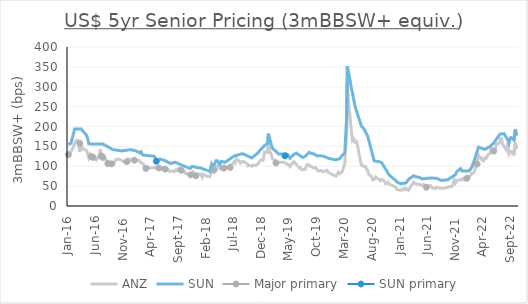
| Category | ANZ | SUN |
|---|---|---|
| 2022-10-13 | 148.5 | 183.5 |
| 2022-10-06 | 147 | 181 |
| 2022-09-29 | 159.5 | 193.5 |
| 2022-09-22 | 130.5 | 165.5 |
| 2022-09-15 | 130.5 | 168 |
| 2022-09-08 | 137.5 | 172 |
| 2022-09-01 | 136.5 | 171.5 |
| 2022-08-25 | 131.5 | 158.5 |
| 2022-08-19 | 158.5 | 165.5 |
| 2022-08-12 | 140.341 | 171 |
| 2022-08-05 | 144.687 | 176.5 |
| 2022-07-28 | 151.103 | 182 |
| 2022-07-21 | 154.136 | 181.667 |
| 2022-07-14 | 172.236 | 181.333 |
| 2022-07-07 | 161.955 | 181 |
| 2022-06-30 | 157.321 | 176.5 |
| 2022-06-23 | 157.205 | 172 |
| 2022-06-16 | 154.849 | 167.5 |
| 2022-06-09 | 141.619 | 163 |
| 2022-06-02 | 140.44 | 158.5 |
| 2022-05-26 | 142.055 | 155.5 |
| 2022-05-19 | 145.334 | 152.5 |
| 2022-05-12 | 131.483 | 149.5 |
| 2022-05-05 | 130.643 | 147.75 |
| 2022-04-28 | 125.82 | 146 |
| 2022-04-21 | 119.404 | 144.25 |
| 2022-04-13 | 120.439 | 142.5 |
| 2022-04-07 | 113.356 | 143.6 |
| 2022-03-31 | 114.188 | 144.7 |
| 2022-03-24 | 121.983 | 145.8 |
| 2022-03-17 | 122.1 | 146.9 |
| 2022-03-10 | 127.907 | 148 |
| 2022-03-03 | 107.577 | 137.5 |
| 2022-02-24 | 101.848 | 127 |
| 2022-02-17 | 87.036 | 117.5 |
| 2022-02-10 | 83.041 | 108 |
| 2022-02-03 | 82.528 | 98.5 |
| 2022-01-20 | 73.951 | 89 |
| 2022-01-13 | 73.574 | 88.533 |
| 2022-01-06 | 71.024 | 88.067 |
| 2021-12-29 | 66.916 | 87.6 |
| 2021-12-22 | 66.223 | 88.5 |
| 2021-12-16 | 68.843 | 88.25 |
| 2021-12-09 | 65.804 | 88 |
| 2021-12-02 | 66.676 | 94 |
| 2021-11-11 | 63.678 | 86.5 |
| 2021-11-04 | 57.914 | 79 |
| 2021-10-28 | 65.005 | 76.875 |
| 2021-10-21 | 53.151 | 74.75 |
| 2021-10-14 | 48.831 | 72.625 |
| 2021-10-07 | 48.622 | 70.5 |
| 2021-09-30 | 49.046 | 68.333 |
| 2021-09-23 | 46.788 | 66.167 |
| 2021-08-20 | 44.039 | 64 |
| 2021-08-13 | 45.116 | 65.375 |
| 2021-08-06 | 45.358 | 66.75 |
| 2021-07-30 | 45.684 | 68.125 |
| 2021-07-23 | 47.023 | 69.5 |
| 2021-07-16 | 43.845 | 69.75 |
| 2021-07-09 | 44.7 | 70 |
| 2021-07-02 | 44.736 | 70.25 |
| 2021-06-25 | 48.301 | 70.5 |
| 2021-06-21 | 50.943 | 70 |
| 2021-05-28 | 51.105 | 69.5 |
| 2021-05-21 | 51.777 | 69 |
| 2021-05-14 | 54.055 | 68.5 |
| 2021-05-07 | 51.357 | 68 |
| 2021-04-30 | 52.515 | 69.6 |
| 2021-04-23 | 54.379 | 71.2 |
| 2021-04-09 | 54.578 | 72.8 |
| 2021-03-26 | 56.686 | 74.4 |
| 2021-03-19 | 59.281 | 76 |
| 2021-03-05 | 50.365 | 71.5 |
| 2021-02-19 | 39.801 | 67 |
| 2021-02-12 | 42.783 | 62.5 |
| 2021-02-05 | 41.109 | 58 |
| 2021-01-29 | 44.645 | 57.5 |
| 2021-01-22 | 40.741 | 57 |
| 2021-01-15 | 42.383 | 56.5 |
| 2021-01-08 | 39.294 | 56 |
| 2020-12-18 | 41.48 | 60 |
| 2020-12-11 | 47.15 | 64 |
| 2020-11-06 | 55.115 | 77.5 |
| 2020-10-30 | 59.536 | 82 |
| 2020-10-23 | 56.068 | 87.4 |
| 2020-10-16 | 56.192 | 92.8 |
| 2020-10-09 | 61.671 | 98.2 |
| 2020-10-02 | 65.692 | 103.6 |
| 2020-09-25 | 66.801 | 109 |
| 2020-09-18 | 63.329 | 110.25 |
| 2020-09-11 | 66.946 | 111.5 |
| 2020-08-21 | 72.761 | 112.75 |
| 2020-08-14 | 66.597 | 114 |
| 2020-08-07 | 65.679 | 126.2 |
| 2020-07-31 | 73.313 | 138.4 |
| 2020-07-24 | 77.172 | 150.6 |
| 2020-07-17 | 78.083 | 162.8 |
| 2020-07-10 | 89.111 | 175 |
| 2020-07-03 | 92.739 | 181.5 |
| 2020-06-26 | 99.387 | 188 |
| 2020-06-19 | 99.484 | 194.5 |
| 2020-06-05 | 103.141 | 201 |
| 2020-05-29 | 117.304 | 211 |
| 2020-05-22 | 133.469 | 221 |
| 2020-05-15 | 152.922 | 231 |
| 2020-05-08 | 162.392 | 241 |
| 2020-05-01 | 160.503 | 251 |
| 2020-04-24 | 168.605 | 267.833 |
| 2020-04-17 | 164.95 | 284.667 |
| 2020-04-09 | 196.654 | 301.5 |
| 2020-04-03 | 229.939 | 318.333 |
| 2020-03-27 | 253.087 | 335.167 |
| 2020-03-20 | 307.672 | 352 |
| 2020-03-16 | 191.612 | 222 |
| 2020-03-06 | 106.522 | 136 |
| 2020-03-03 | 103.903 | 131.75 |
| 2020-02-21 | 86.15 | 127.5 |
| 2020-02-14 | 83.234 | 123.25 |
| 2020-02-07 | 81.844 | 119 |
| 2020-01-31 | 84.77 | 118 |
| 2020-01-24 | 78.778 | 117 |
| 2020-01-17 | 75.128 | 116 |
| 2019-12-06 | 84.26 | 120 |
| 2019-11-29 | 89.695 | 122 |
| 2019-11-15 | 86.782 | 124 |
| 2019-11-08 | 86.382 | 126 |
| 2019-10-25 | 89.292 | 126.125 |
| 2019-10-18 | 88.122 | 126.25 |
| 2019-10-11 | 87.872 | 126.375 |
| 2019-10-04 | 92.882 | 126.5 |
| 2019-09-27 | 96.922 | 128.625 |
| 2019-09-20 | 95.314 | 130.75 |
| 2019-08-30 | 100.058 | 132.875 |
| 2019-08-23 | 102.121 | 135 |
| 2019-08-16 | 104.313 | 131.75 |
| 2019-08-09 | 102.363 | 128.5 |
| 2019-08-02 | 92.27 | 125.25 |
| 2019-07-19 | 91.524 | 122 |
| 2019-07-12 | 91.504 | 124.2 |
| 2019-07-05 | 97.15 | 126.4 |
| 2019-06-28 | 96.326 | 128.6 |
| 2019-06-21 | 100.782 | 130.8 |
| 2019-06-14 | 104.834 | 133 |
| 2019-05-31 | 111.43 | 129.75 |
| 2019-05-24 | 108.853 | 126.5 |
| 2019-05-17 | 104.897 | 123.25 |
| 2019-05-10 | 99.051 | 120 |
| 2019-04-26 | 105.381 | 130 |
| 2019-04-12 | 108.349 | 130.333 |
| 2019-04-03 | 110.038 | 130.667 |
| 2019-03-08 | 110 | 131 |
| 2019-03-01 | 110 | 134 |
| 2019-02-22 | 111.48 | 137 |
| 2019-02-15 | 115.76 | 140 |
| 2019-02-08 | 117 | 143 |
| 2019-02-01 | 119.5 | 146 |
| 2019-01-25 | 132.5 | 158 |
| 2019-01-18 | 137 | 170 |
| 2019-01-11 | 159.5 | 182 |
| 2019-01-07 | 135 | 157 |
| 2018-12-21 | 136 | 152.4 |
| 2018-12-13 | 115.5 | 147.8 |
| 2018-12-03 | 116.5 | 143.2 |
| 2018-11-23 | 112 | 139 |
| 2018-11-16 | 107 | 134 |
| 2018-11-02 | 101.5 | 128.8 |
| 2018-10-26 | 102.5 | 126.2 |
| 2018-10-19 | 102.5 | 123.6 |
| 2018-10-12 | 100 | 121 |
| 2018-10-05 | 102 | 122.5 |
| 2018-09-28 | 102 | 124 |
| 2018-09-21 | 101 | 125.5 |
| 2018-09-17 | 106.5 | 127 |
| 2018-09-07 | 109 | 128.5 |
| 2018-08-31 | 111.5 | 130 |
| 2018-08-17 | 111 | 131.5 |
| 2018-08-10 | 108 | 130.5 |
| 2018-08-03 | 114 | 129.5 |
| 2018-07-27 | 114 | 128.5 |
| 2018-07-20 | 119 | 127.5 |
| 2018-07-12 | 108.5 | 126.5 |
| 2018-07-06 | 111 | 125.5 |
| 2018-06-29 | 106.5 | 123.286 |
| 2018-06-22 | 103 | 121.071 |
| 2018-06-15 | 100.5 | 118.857 |
| 2018-06-08 | 96.5 | 116.643 |
| 2018-06-01 | 95.5 | 114.429 |
| 2018-05-25 | 98 | 112.214 |
| 2018-05-18 | 98 | 110 |
| 2018-05-11 | 91 | 110.8 |
| 2018-05-04 | 93 | 111.6 |
| 2018-04-27 | 93 | 112.4 |
| 2018-04-20 | 93 | 104 |
| 2018-04-06 | 101 | 114 |
| 2018-03-29 | 98 | 114 |
| 2018-03-19 | 85.5 | 103.2 |
| 2018-03-09 | 91.5 | 101 |
| 2018-03-05 | 84.5 | 105 |
| 2018-02-23 | 73.5 | 87 |
| 2018-02-12 | 74.5 | 88.875 |
| 2018-02-02 | 76 | 90.75 |
| 2018-01-19 | 80 | 92.625 |
| 2018-01-12 | 72.5 | 94.5 |
| 2018-01-05 | 80 | 95.5 |
| 2017-12-15 | 80.5 | 96.5 |
| 2017-12-08 | 81.5 | 97.5 |
| 2017-12-01 | 80.5 | 98.5 |
| 2017-11-24 | 85 | 99.5 |
| 2017-11-17 | 77.5 | 99.571 |
| 2017-11-10 | 75.5 | 95 |
| 2017-11-03 | 76.5 | 95 |
| 2017-10-27 | 80.5 | 96.5 |
| 2017-10-20 | 81.5 | 97.666 |
| 2017-10-13 | 81.5 | 98.833 |
| 2017-10-06 | 87.5 | 100 |
| 2017-09-29 | 86.5 | 101.429 |
| 2017-09-22 | 91 | 102.857 |
| 2017-09-18 | 90 | 104.286 |
| 2017-09-08 | 94.5 | 105.714 |
| 2017-09-01 | 93.5 | 107.143 |
| 2017-08-25 | 88.5 | 108.571 |
| 2017-08-18 | 90 | 110 |
| 2017-08-11 | 86.5 | 109.25 |
| 2017-08-04 | 88.5 | 108.5 |
| 2017-07-28 | 87.5 | 107.75 |
| 2017-07-21 | 87.5 | 107 |
| 2017-07-14 | 87.5 | 108.749 |
| 2017-07-07 | 92 | 110.499 |
| 2017-06-30 | 95 | 112.25 |
| 2017-06-23 | 95.5 | 114 |
| 2017-06-16 | 94.5 | 114.999 |
| 2017-06-09 | 96.5 | 115.999 |
| 2017-06-02 | 93 | 117 |
| 2017-05-26 | 97 | 118 |
| 2017-05-19 | 95.5 | 116.5 |
| 2017-05-12 | 95 | 116 |
| 2017-05-05 | 95.5 | 116 |
| 2017-04-24 | 97.5 | 125.333 |
| 2017-04-12 | 95.5 | 125.667 |
| 2017-04-07 | 95.5 | 126 |
| 2017-03-31 | 96.5 | 126.333 |
| 2017-03-23 | 97.5 | 126.667 |
| 2017-03-17 | 98.5 | 127 |
| 2017-03-10 | 94 | 127.333 |
| 2017-03-03 | 93 | 127.667 |
| 2017-02-23 | 106 | 128 |
| 2017-02-17 | 107 | 129.9 |
| 2017-02-10 | 109.5 | 136.5 |
| 2017-02-03 | 111.5 | 133.7 |
| 2017-01-30 | 115 | 135.6 |
| 2017-01-20 | 115.5 | 137.5 |
| 2017-01-13 | 114 | 138.625 |
| 2017-01-05 | 113 | 139.75 |
| 2016-12-21 | 114 | 140.875 |
| 2016-12-15 | 115 | 142 |
| 2016-12-08 | 118 | 141.417 |
| 2016-12-01 | 118 | 140.833 |
| 2016-11-24 | 109 | 140.25 |
| 2016-11-11 | 111 | 139.667 |
| 2016-11-03 | 112.197 | 139.083 |
| 2016-10-28 | 114 | 138.5 |
| 2016-10-20 | 116.5 | 139 |
| 2016-10-13 | 117.639 | 139.5 |
| 2016-10-07 | 118 | 140 |
| 2016-09-29 | 116.565 | 140.5 |
| 2016-09-22 | 115.865 | 141 |
| 2016-09-15 | 107.111 | 141.5 |
| 2016-09-08 | 103.709 | 142 |
| 2016-09-01 | 105.694 | 143.75 |
| 2016-08-26 | 105.342 | 145.5 |
| 2016-08-19 | 108 | 147.25 |
| 2016-08-12 | 108.454 | 149 |
| 2016-08-05 | 114.316 | 150.75 |
| 2016-07-29 | 117.342 | 152.5 |
| 2016-07-22 | 125.802 | 154.25 |
| 2016-07-15 | 126 | 156 |
| 2016-07-08 | 128 | 156 |
| 2016-07-01 | 142.5 | 156 |
| 2016-06-29 | 131.024 | 156 |
| 2016-06-17 | 119.5 | 156 |
| 2016-06-10 | 116.5 | 156 |
| 2016-06-03 | 121 | 156 |
| 2016-05-26 | 121.43 | 156 |
| 2016-05-23 | 123 | 156 |
| 2016-05-13 | 120 | 156 |
| 2016-05-06 | 128.753 | 156 |
| 2016-04-29 | 121 | 157 |
| 2016-04-22 | 133 | 171.5 |
| 2016-04-15 | 140.563 | 179.2 |
| 2016-04-08 | 141.5 | 182.9 |
| 2016-04-01 | 142.5 | 186.6 |
| 2016-03-24 | 146.717 | 190.3 |
| 2016-03-18 | 160 | 194 |
| 2016-03-11 | 135.868 | 194 |
| 2016-03-04 | 162 | 194 |
| 2016-02-26 | 165.5 | 194 |
| 2016-02-19 | 163.5 | 194 |
| 2016-02-12 | 158 | 194 |
| 2016-02-05 | 149 | 182 |
| 2016-01-29 | 142 | 170 |
| 2016-01-22 | 137 | 158 |
| 2016-01-15 | 132 | 156.333 |
| 2016-01-08 | 124 | 154.667 |